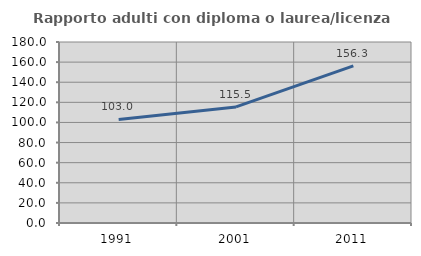
| Category | Rapporto adulti con diploma o laurea/licenza media  |
|---|---|
| 1991.0 | 103.03 |
| 2001.0 | 115.457 |
| 2011.0 | 156.338 |